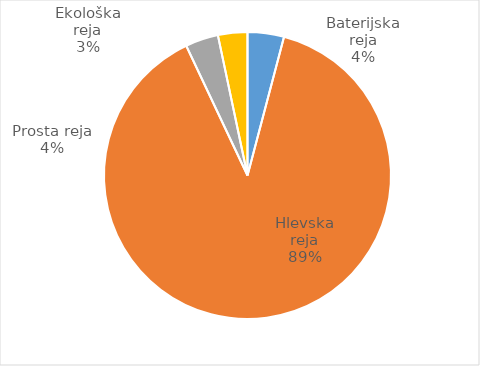
| Category | Količina kosov jajc |
|---|---|
| Baterijska reja | 134006 |
| Hlevska reja | 2905274 |
| Prosta reja | 121217 |
| Ekološka reja | 108300 |